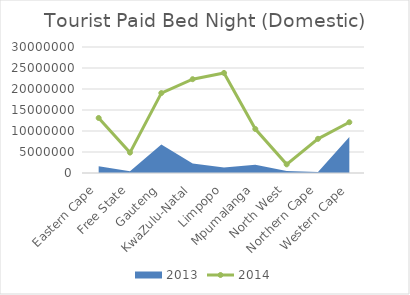
| Category | 2014 |
|---|---|
| Eastern Cape | 13101000 |
| Free State | 4858000 |
| Gauteng | 19037000 |
| KwaZulu-Natal | 22336000 |
| Limpopo | 23823000 |
| Mpumalanga | 10471000 |
| North West | 2058000 |
| Northern Cape | 8137000 |
| Western Cape | 12086000 |